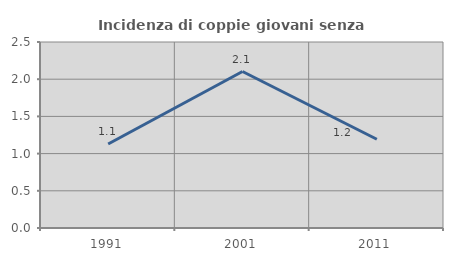
| Category | Incidenza di coppie giovani senza figli |
|---|---|
| 1991.0 | 1.129 |
| 2001.0 | 2.103 |
| 2011.0 | 1.193 |